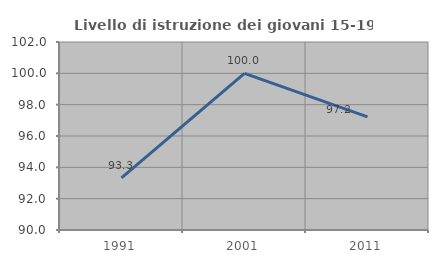
| Category | Livello di istruzione dei giovani 15-19 anni |
|---|---|
| 1991.0 | 93.333 |
| 2001.0 | 100 |
| 2011.0 | 97.222 |